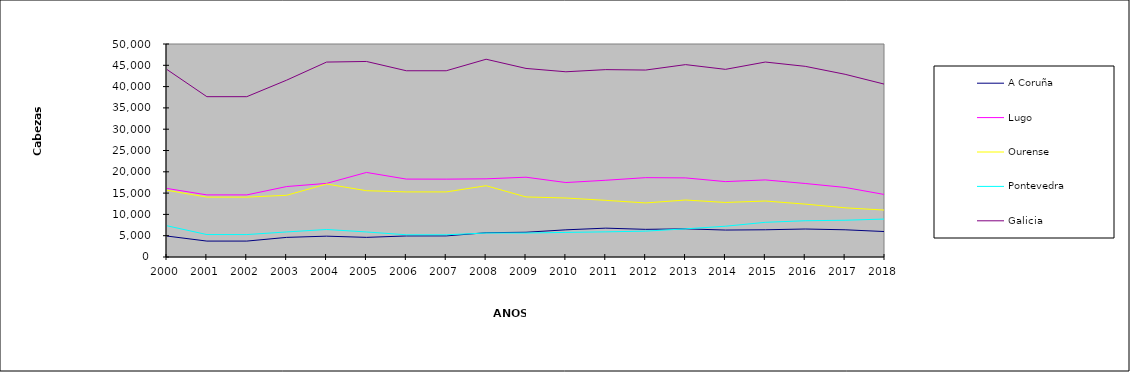
| Category | A Coruña | Lugo | Ourense | Pontevedra | Galicia |
|---|---|---|---|---|---|
| 2000.0 | 4917 | 16089 | 15669 | 7325 | 44000 |
| 2001.0 | 3734 | 14579 | 14057 | 5264 | 37634 |
| 2002.0 | 3734 | 14579 | 14057 | 5264 | 37634 |
| 2003.0 | 4606 | 16539 | 14488 | 5880 | 41513 |
| 2004.0 | 4891 | 17279 | 17131 | 6456 | 45757 |
| 2005.0 | 4609 | 19850 | 15565 | 5876 | 45900 |
| 2006.0 | 4937 | 18289 | 15278 | 5214 | 43718 |
| 2007.0 | 4950 | 18276 | 15278 | 5214 | 43718 |
| 2008.0 | 5701 | 18352 | 16736 | 5632 | 46421 |
| 2009.0 | 5808 | 18730 | 14098 | 5630 | 44266 |
| 2010.0 | 6379 | 17479 | 13848 | 5773 | 43479 |
| 2011.0 | 6772 | 18015 | 13296 | 5902 | 43985 |
| 2012.0 | 6491 | 18627 | 12693 | 6073 | 43884 |
| 2013.0 | 6610 | 18569 | 13375 | 6607 | 45161 |
| 2014.0 | 6326 | 17697 | 12803 | 7223 | 44049 |
| 2015.0 | 6390 | 18097 | 13141 | 8139 | 45767 |
| 2016.0 | 6571 | 17257 | 12419 | 8511 | 44758 |
| 2017.0 | 6386 | 16329 | 11544 | 8628 | 42887 |
| 2018.0 | 5969 | 14649 | 11006 | 8914 | 40538 |